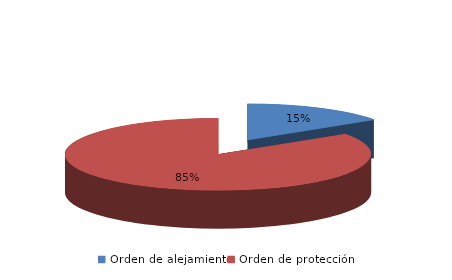
| Category | Series 0 |
|---|---|
| Orden de alejamiento | 23 |
| Orden de protección | 126 |